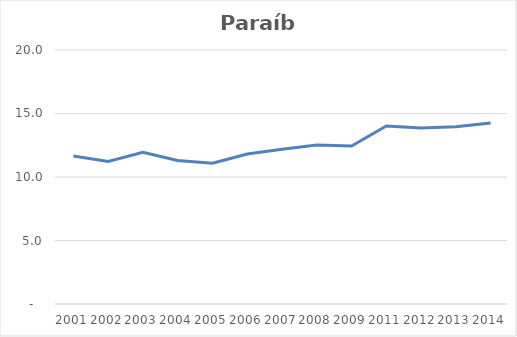
| Category | Total |
|---|---|
| 2001.0 | 11.651 |
| 2002.0 | 11.227 |
| 2003.0 | 11.939 |
| 2004.0 | 11.297 |
| 2005.0 | 11.091 |
| 2006.0 | 11.811 |
| 2007.0 | 12.18 |
| 2008.0 | 12.512 |
| 2009.0 | 12.446 |
| 2011.0 | 14.022 |
| 2012.0 | 13.861 |
| 2013.0 | 13.957 |
| 2014.0 | 14.252 |